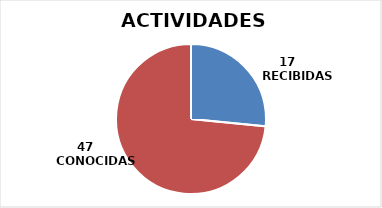
| Category | Series 0 |
|---|---|
| 0 | 17 |
| 1 | 47 |